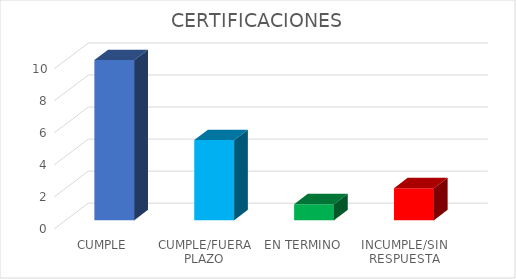
| Category | TOTAL |
|---|---|
| CUMPLE | 10 |
| CUMPLE/FUERA PLAZO | 5 |
| EN TERMINO | 1 |
| INCUMPLE/SIN RESPUESTA | 2 |